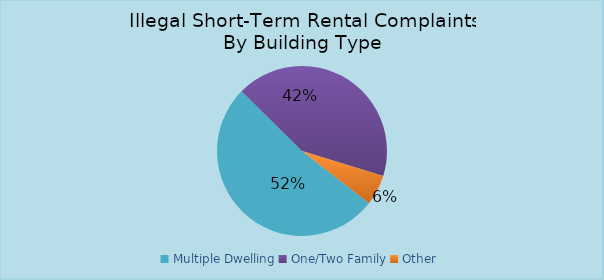
| Category | Series 0 |
|---|---|
| Multiple Dwelling | 1048 |
| One/Two Family | 856 |
| Other | 117 |